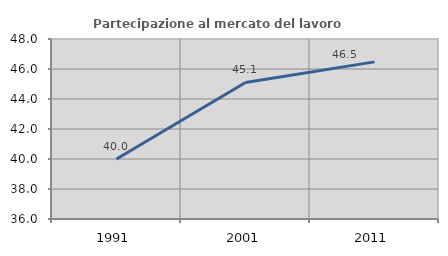
| Category | Partecipazione al mercato del lavoro  femminile |
|---|---|
| 1991.0 | 40 |
| 2001.0 | 45.102 |
| 2011.0 | 46.474 |